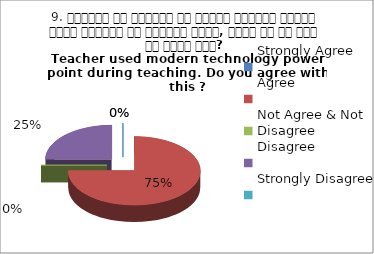
| Category | 9. शिक्षक ने शिक्षण के दौरान आधुनिक तकनीक पावर पॉइन्ट का प्रयोग किया, क्या आप इस बात से सहमत हैं? 
Teacher used modern technology power point during teaching. Do you agree with this ?
 Disagree Agree Agree Agree |
|---|---|
| Strongly Agree | 0 |
| Agree | 3 |
| Not Agree & Not Disagree | 0 |
| Disagree | 1 |
| Strongly Disagree | 0 |